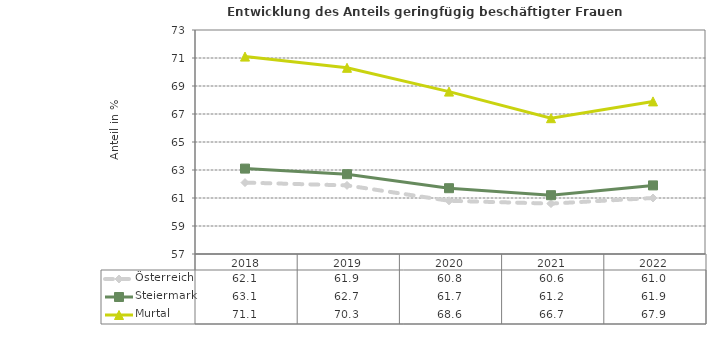
| Category | Österreich | Steiermark | Murtal |
|---|---|---|---|
| 2022.0 | 61 | 61.9 | 67.9 |
| 2021.0 | 60.6 | 61.2 | 66.7 |
| 2020.0 | 60.8 | 61.7 | 68.6 |
| 2019.0 | 61.9 | 62.7 | 70.3 |
| 2018.0 | 62.1 | 63.1 | 71.1 |